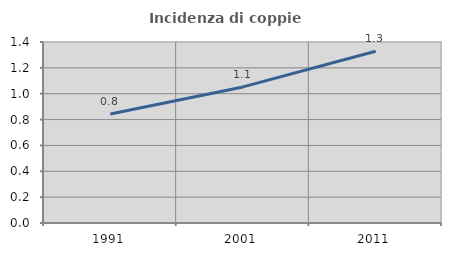
| Category | Incidenza di coppie miste |
|---|---|
| 1991.0 | 0.843 |
| 2001.0 | 1.053 |
| 2011.0 | 1.328 |